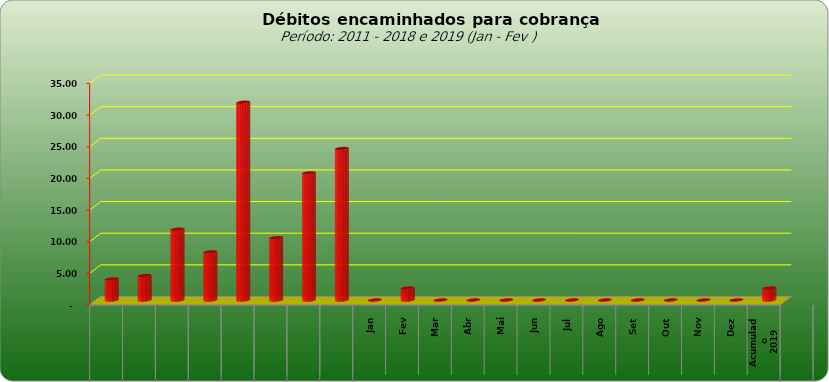
| Category |  3.309.443,02  |
|---|---|
| 0 | 3309443.02 |
| 1 | 3859728.44 |
| 2 | 11181928.25 |
| 3 | 7600526.01 |
| 4 | 31248623.5 |
| 5 | 9830198.34 |
| 6 | 20083556.95 |
| 7 | 23931734.08 |
| 8 | 0 |
| 9 | 1897202.11 |
| 10 | 0 |
| 11 | 0 |
| 12 | 0 |
| 13 | 0 |
| 14 | 0 |
| 15 | 0 |
| 16 | 0 |
| 17 | 0 |
| 18 | 0 |
| 19 | 0 |
| 20 | 1897202.11 |